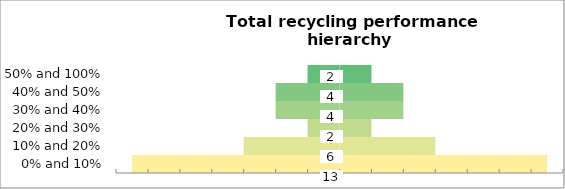
| Category | Series 0 | Series 1 |
|---|---|---|
| 0% and 10% | -6.5 | 6.5 |
| 10% and 20% | -3 | 3 |
| 20% and 30% | -1 | 1 |
| 30% and 40% | -2 | 2 |
| 40% and 50% | -2 | 2 |
| 50% and 100% | -1 | 1 |